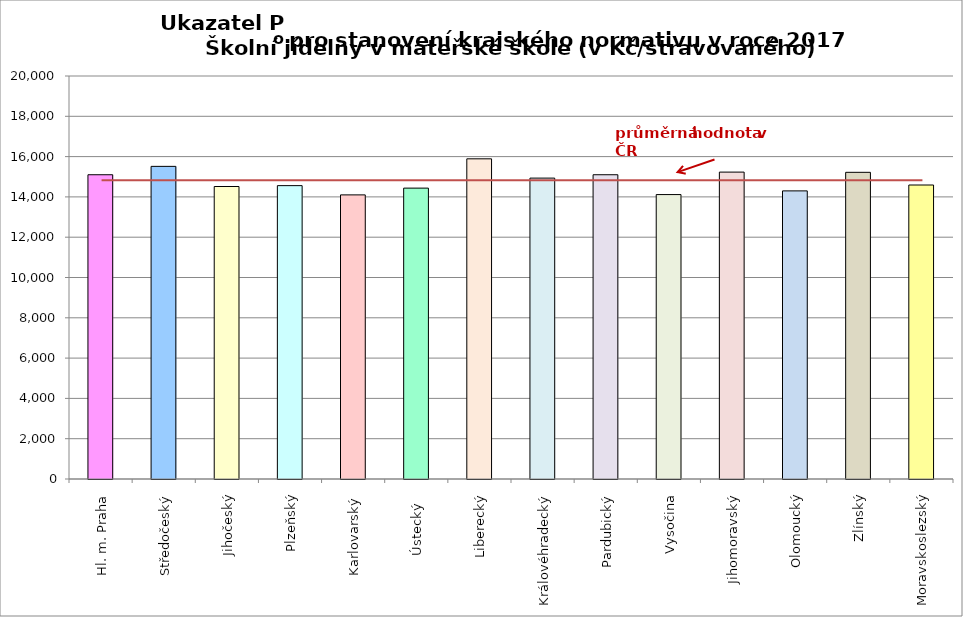
| Category | Series 0 |
|---|---|
| Hl. m. Praha | 15100 |
| Středočeský | 15515 |
| Jihočeský | 14516 |
| Plzeňský | 14559 |
| Karlovarský  | 14100 |
| Ústecký   | 14436 |
| Liberecký | 15890 |
| Královéhradecký | 14933 |
| Pardubický | 15100 |
| Vysočina | 14116 |
| Jihomoravský | 15231 |
| Olomoucký | 14299 |
| Zlínský | 15220 |
| Moravskoslezský | 14590 |